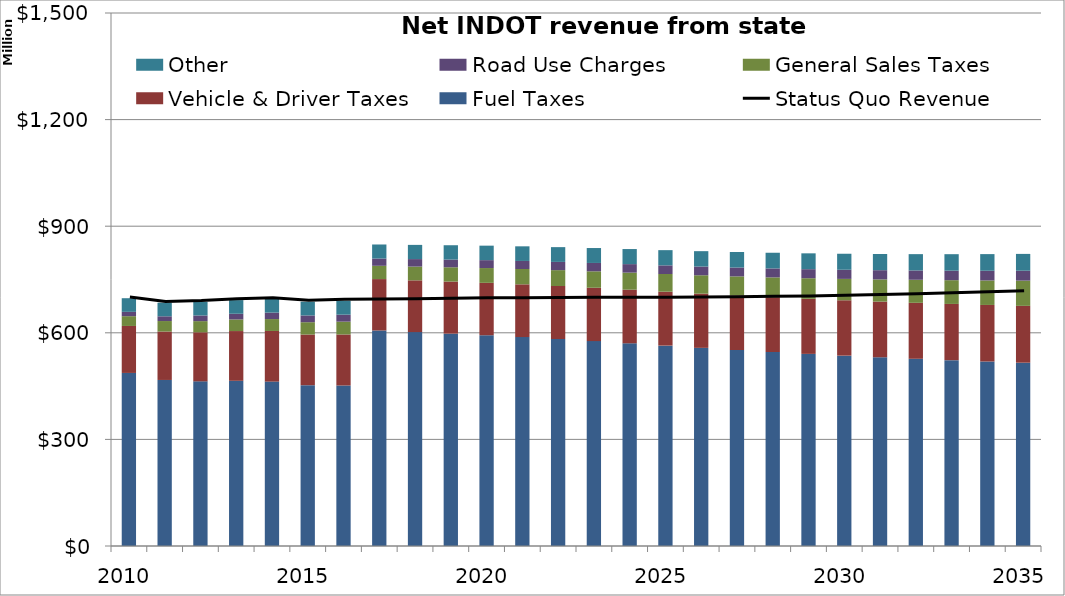
| Category | Fuel Taxes | Vehicle & Driver Taxes | General Sales Taxes | Road Use Charges | Other |
|---|---|---|---|---|---|
| 2010.0 | 487022873.393 | 132226261.712 | 27511595.244 | 12190784.587 | 38400000 |
| 2011.0 | 467266469.258 | 136264719.038 | 29571250.187 | 13319815.864 | 38400000 |
| 2012.0 | 463356458.588 | 138048775.278 | 31433844.686 | 15913479.203 | 38400000 |
| 2013.0 | 464926116.585 | 139989729.725 | 32709513.838 | 15949340.683 | 38400000 |
| 2014.0 | 462673256.485 | 142470254.053 | 33514569.93 | 18140894.882 | 38400000 |
| 2015.0 | 452560137.233 | 142541704.908 | 34709004.589 | 18999667.964 | 38784000 |
| 2016.0 | 451677535.923 | 143617613.369 | 36090353.72 | 19643400.262 | 39171840 |
| 2017.0 | 606456740.799 | 144735910.191 | 37382699.744 | 20392813.69 | 39563558.4 |
| 2018.0 | 601940785.857 | 145671699.219 | 38728843.846 | 21111475.711 | 39959193.984 |
| 2019.0 | 597605451.636 | 146585960.252 | 40200049.541 | 21698527.98 | 40358785.924 |
| 2020.0 | 593104702.331 | 147482885.072 | 41662707.538 | 22231347.902 | 40762373.783 |
| 2021.0 | 588039994.984 | 148364594.47 | 43083589.138 | 22713183.531 | 41169997.521 |
| 2022.0 | 582527138.236 | 149234349.643 | 44592469.456 | 23153462.211 | 41581697.496 |
| 2023.0 | 576665166.685 | 150094174.214 | 46248088.312 | 23558624.284 | 41997514.471 |
| 2024.0 | 570429314.574 | 150944914.678 | 47985815.533 | 23933756.999 | 42417489.616 |
| 2025.0 | 563904226.511 | 151786988.682 | 49789653.808 | 24282881.883 | 42841664.512 |
| 2026.0 | 557567907.021 | 152619814.765 | 51694866.129 | 24609247.881 | 43270081.157 |
| 2027.0 | 551570840.702 | 153445189.867 | 53709994.728 | 24915558.76 | 43702781.969 |
| 2028.0 | 545923573.47 | 154263351.644 | 55753731.104 | 25204077.512 | 44139809.788 |
| 2029.0 | 540618762.147 | 155075047.859 | 57885614.942 | 25476683.746 | 44581207.886 |
| 2030.0 | 535689644.969 | 155881033.197 | 60140097.706 | 25735040.063 | 45027019.965 |
| 2031.0 | 531116351.156 | 156680463.216 | 62442312.109 | 25980491.789 | 45477290.165 |
| 2032.0 | 526895306.458 | 157474719.033 | 64870620.566 | 26214224.291 | 45932063.066 |
| 2033.0 | 522935199.534 | 158298395.89 | 66867948.952 | 26756364.074 | 46391383.697 |
| 2034.0 | 519257978.865 | 159120812.778 | 68926773.907 | 27309750.61 | 46855297.534 |
| 2035.0 | 515856371.256 | 159941794.021 | 71048988.877 | 27874604.5 | 47323850.509 |